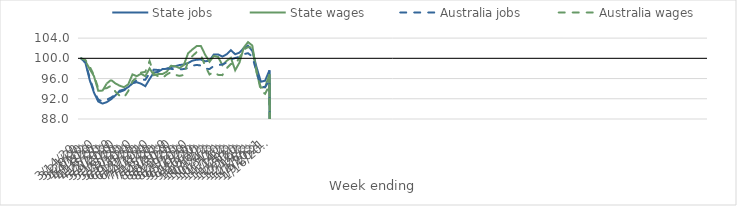
| Category | State jobs | State wages | Australia jobs | Australia wages |
|---|---|---|---|---|
| 14/03/2020 | 100 | 100 | 100 | 100 |
| 21/03/2020 | 99.108 | 99.427 | 99.215 | 99.668 |
| 28/03/2020 | 95.719 | 97.898 | 96.153 | 98.379 |
| 04/04/2020 | 93.228 | 96.465 | 93.502 | 96.626 |
| 11/04/2020 | 91.459 | 93.575 | 91.838 | 94.061 |
| 18/04/2020 | 91.05 | 93.62 | 91.448 | 93.977 |
| 25/04/2020 | 91.34 | 95.036 | 91.813 | 94.111 |
| 02/05/2020 | 91.908 | 95.723 | 92.231 | 94.578 |
| 09/05/2020 | 92.654 | 95.038 | 92.806 | 93.416 |
| 16/05/2020 | 93.595 | 94.593 | 93.353 | 92.605 |
| 23/05/2020 | 93.83 | 94.289 | 93.674 | 92.236 |
| 30/05/2020 | 94.303 | 94.841 | 94.181 | 93.508 |
| 06/06/2020 | 95.063 | 96.824 | 95.128 | 95.497 |
| 13/06/2020 | 95.281 | 96.47 | 95.639 | 96.189 |
| 20/06/2020 | 94.979 | 96.946 | 95.802 | 97.174 |
| 27/06/2020 | 94.488 | 96.463 | 95.768 | 97.323 |
| 04/07/2020 | 95.915 | 98.015 | 97.053 | 99.476 |
| 11/07/2020 | 97.201 | 96.66 | 97.772 | 96.928 |
| 18/07/2020 | 97.319 | 96.897 | 97.691 | 96.451 |
| 25/07/2020 | 97.878 | 96.901 | 97.829 | 96.097 |
| 01/08/2020 | 97.927 | 97.333 | 97.979 | 96.806 |
| 08/08/2020 | 98.273 | 98.533 | 97.922 | 97.248 |
| 15/08/2020 | 98.444 | 98.419 | 97.789 | 96.723 |
| 22/08/2020 | 98.675 | 98.072 | 97.812 | 96.531 |
| 29/08/2020 | 98.788 | 98.688 | 97.884 | 96.715 |
| 05/09/2020 | 99.073 | 100.999 | 98.101 | 99.468 |
| 12/09/2020 | 99.539 | 101.76 | 98.536 | 100.455 |
| 19/09/2020 | 99.732 | 102.415 | 98.701 | 101.226 |
| 26/09/2020 | 99.76 | 102.425 | 98.574 | 100.61 |
| 03/10/2020 | 99.416 | 100.683 | 97.954 | 98.463 |
| 10/10/2020 | 99.539 | 99.314 | 97.882 | 96.815 |
| 17/10/2020 | 100.751 | 100.467 | 98.486 | 97.316 |
| 24/10/2020 | 100.775 | 100.282 | 98.675 | 96.732 |
| 31/10/2020 | 100.349 | 98.67 | 98.779 | 96.679 |
| 07/11/2020 | 100.786 | 99.499 | 99.161 | 98.026 |
| 14/11/2020 | 101.604 | 100.101 | 99.803 | 98.893 |
| 21/11/2020 | 100.807 | 97.641 | 100.059 | 98.847 |
| 28/11/2020 | 101.13 | 99.152 | 100.31 | 100.101 |
| 05/12/2020 | 102.019 | 102.113 | 100.817 | 101.732 |
| 12/12/2020 | 102.508 | 103.208 | 101.015 | 102.219 |
| 19/12/2020 | 101.464 | 102.534 | 100.355 | 102.16 |
| 26/12/2020 | 98.233 | 97.166 | 97.322 | 97.485 |
| 02/01/2021 | 95.371 | 94.197 | 94.445 | 93.574 |
| 09/01/2021 | 95.584 | 94.299 | 94.284 | 92.978 |
| 16/01/2021 | 97.617 | 96.829 | 95.7 | 94.76 |